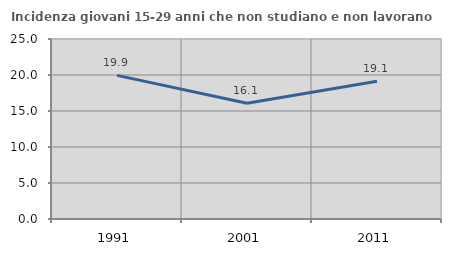
| Category | Incidenza giovani 15-29 anni che non studiano e non lavorano  |
|---|---|
| 1991.0 | 19.949 |
| 2001.0 | 16.075 |
| 2011.0 | 19.13 |